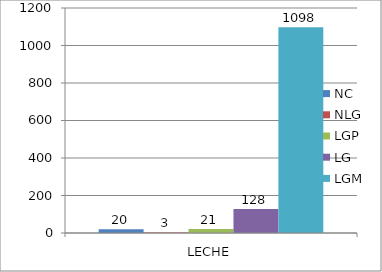
| Category | NC | NLG | LGP | LG | LGM |
|---|---|---|---|---|---|
| 0 | 20 | 3 | 21 | 128 | 1098 |